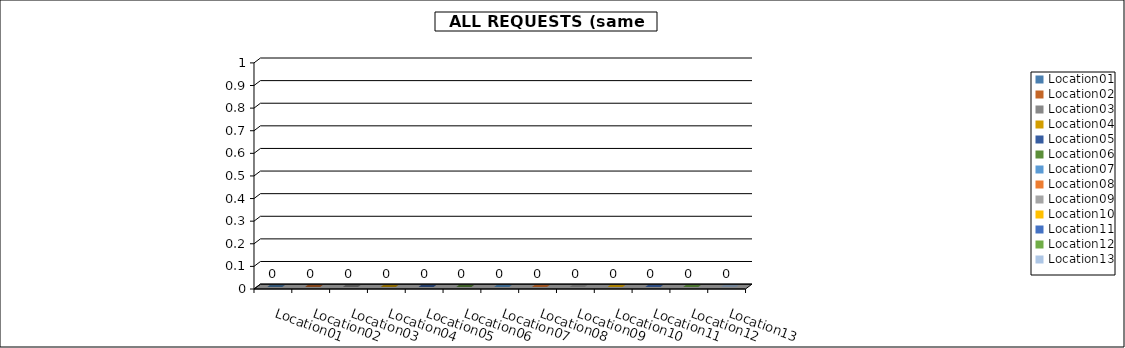
| Category | Series 0 |
|---|---|
| Location01 | 0 |
| Location02 | 0 |
| Location03 | 0 |
| Location04 | 0 |
| Location05 | 0 |
| Location06 | 0 |
| Location07 | 0 |
| Location08 | 0 |
| Location09 | 0 |
| Location10 | 0 |
| Location11 | 0 |
| Location12 | 0 |
| Location13 | 0 |